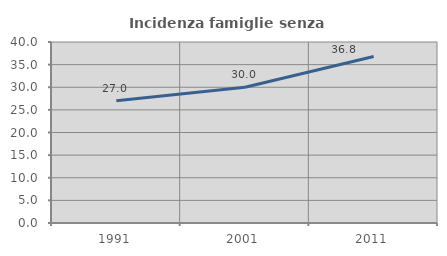
| Category | Incidenza famiglie senza nuclei |
|---|---|
| 1991.0 | 27.002 |
| 2001.0 | 29.983 |
| 2011.0 | 36.805 |